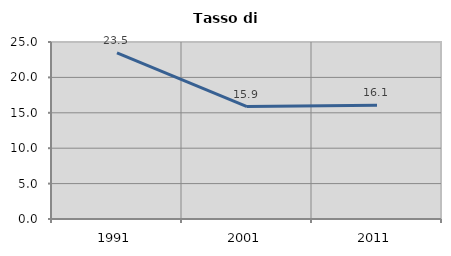
| Category | Tasso di disoccupazione   |
|---|---|
| 1991.0 | 23.452 |
| 2001.0 | 15.878 |
| 2011.0 | 16.075 |